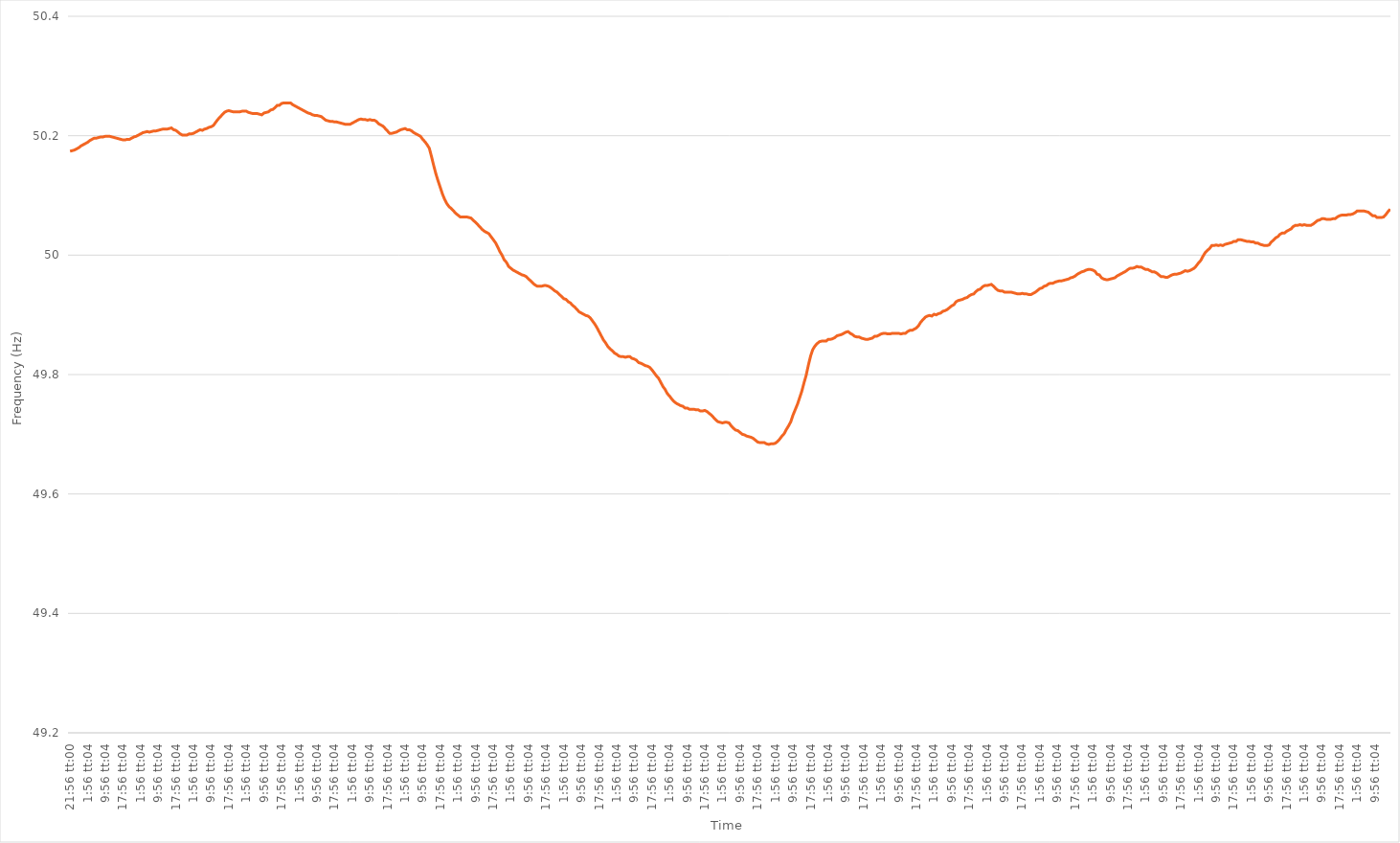
| Category | Series 0 |
|---|---|
| 0.9138888888888889 | 50.174 |
| 0.913900462962963 | 50.175 |
| 0.9139120370370369 | 50.176 |
| 0.9139236111111111 | 50.178 |
| 0.9139351851851852 | 50.18 |
| 0.955601851851852 | 50.183 |
| 0.997268518518519 | 50.185 |
| 1900-01-01 00:56:04 | 50.187 |
| 1900-01-01 01:56:04 | 50.189 |
| 1900-01-01 02:56:04 | 50.192 |
| 1900-01-01 03:56:04 | 50.194 |
| 1900-01-01 04:56:04 | 50.196 |
| 1900-01-01 05:56:04 | 50.196 |
| 1900-01-01 06:56:04 | 50.197 |
| 1900-01-01 07:56:04 | 50.198 |
| 1900-01-01 08:56:04 | 50.198 |
| 1900-01-01 09:56:04 | 50.199 |
| 1900-01-01 10:56:04 | 50.199 |
| 1900-01-01 11:56:04 | 50.199 |
| 1900-01-01 12:56:04 | 50.198 |
| 1900-01-01 13:56:04 | 50.197 |
| 1900-01-01 14:56:04 | 50.196 |
| 1900-01-01 15:56:04 | 50.195 |
| 1900-01-01 16:56:04 | 50.194 |
| 1900-01-01 17:56:04 | 50.193 |
| 1900-01-01 18:56:04 | 50.193 |
| 1900-01-01 19:56:04 | 50.194 |
| 1900-01-01 20:56:04 | 50.194 |
| 1900-01-01 21:56:04 | 50.196 |
| 1900-01-01 22:56:04 | 50.198 |
| 1900-01-01 23:56:04 | 50.199 |
| 1900-01-02 00:56:04 | 50.201 |
| 1900-01-02 01:56:04 | 50.203 |
| 1900-01-02 02:56:04 | 50.205 |
| 1900-01-02 03:56:04 | 50.206 |
| 1900-01-02 04:56:04 | 50.207 |
| 1900-01-02 05:56:04 | 50.206 |
| 1900-01-02 06:56:04 | 50.207 |
| 1900-01-02 07:56:04 | 50.208 |
| 1900-01-02 08:56:04 | 50.208 |
| 1900-01-02 09:56:04 | 50.209 |
| 1900-01-02 10:56:04 | 50.21 |
| 1900-01-02 11:56:04 | 50.211 |
| 1900-01-02 12:56:04 | 50.211 |
| 1900-01-02 13:56:04 | 50.211 |
| 1900-01-02 14:56:04 | 50.212 |
| 1900-01-02 15:56:04 | 50.213 |
| 1900-01-02 16:56:04 | 50.21 |
| 1900-01-02 17:56:04 | 50.209 |
| 1900-01-02 18:56:04 | 50.206 |
| 1900-01-02 19:56:04 | 50.203 |
| 1900-01-02 20:56:04 | 50.201 |
| 1900-01-02 21:56:04 | 50.201 |
| 1900-01-02 22:56:04 | 50.201 |
| 1900-01-02 23:56:04 | 50.203 |
| 1900-01-03 00:56:04 | 50.203 |
| 1900-01-03 01:56:04 | 50.204 |
| 1900-01-03 02:56:04 | 50.206 |
| 1900-01-03 03:56:04 | 50.208 |
| 1900-01-03 04:56:04 | 50.21 |
| 1900-01-03 05:56:04 | 50.209 |
| 1900-01-03 06:56:04 | 50.211 |
| 1900-01-03 07:56:04 | 50.212 |
| 1900-01-03 08:56:04 | 50.214 |
| 1900-01-03 09:56:04 | 50.215 |
| 1900-01-03 10:56:04 | 50.217 |
| 1900-01-03 11:56:04 | 50.222 |
| 1900-01-03 12:56:04 | 50.227 |
| 1900-01-03 13:56:04 | 50.231 |
| 1900-01-03 14:56:04 | 50.235 |
| 1900-01-03 15:56:04 | 50.239 |
| 1900-01-03 16:56:04 | 50.241 |
| 1900-01-03 17:56:04 | 50.242 |
| 1900-01-03 18:56:04 | 50.241 |
| 1900-01-03 19:56:04 | 50.24 |
| 1900-01-03 20:56:04 | 50.24 |
| 1900-01-03 21:56:04 | 50.24 |
| 1900-01-03 22:56:04 | 50.24 |
| 1900-01-03 23:56:04 | 50.241 |
| 1900-01-04 00:56:04 | 50.241 |
| 1900-01-04 01:56:04 | 50.241 |
| 1900-01-04 02:56:04 | 50.239 |
| 1900-01-04 03:56:04 | 50.238 |
| 1900-01-04 04:56:04 | 50.237 |
| 1900-01-04 05:56:04 | 50.237 |
| 1900-01-04 06:56:04 | 50.237 |
| 1900-01-04 07:56:04 | 50.236 |
| 1900-01-04 08:56:04 | 50.235 |
| 1900-01-04 09:56:04 | 50.238 |
| 1900-01-04 10:56:04 | 50.239 |
| 1900-01-04 11:56:04 | 50.24 |
| 1900-01-04 12:56:04 | 50.243 |
| 1900-01-04 13:56:04 | 50.244 |
| 1900-01-04 14:56:04 | 50.247 |
| 1900-01-04 15:56:04 | 50.251 |
| 1900-01-04 16:56:04 | 50.251 |
| 1900-01-04 17:56:04 | 50.254 |
| 1900-01-04 18:56:04 | 50.255 |
| 1900-01-04 19:56:04 | 50.255 |
| 1900-01-04 20:56:04 | 50.255 |
| 1900-01-04 21:56:04 | 50.255 |
| 1900-01-04 22:56:04 | 50.252 |
| 1900-01-04 23:56:04 | 50.25 |
| 1900-01-05 00:56:04 | 50.248 |
| 1900-01-05 01:56:04 | 50.246 |
| 1900-01-05 02:56:04 | 50.244 |
| 1900-01-05 03:56:04 | 50.242 |
| 1900-01-05 04:56:04 | 50.24 |
| 1900-01-05 05:56:04 | 50.238 |
| 1900-01-05 06:56:04 | 50.237 |
| 1900-01-05 07:56:04 | 50.235 |
| 1900-01-05 08:56:04 | 50.234 |
| 1900-01-05 09:56:04 | 50.234 |
| 1900-01-05 10:56:04 | 50.233 |
| 1900-01-05 11:56:04 | 50.232 |
| 1900-01-05 12:56:04 | 50.229 |
| 1900-01-05 13:56:04 | 50.226 |
| 1900-01-05 14:56:04 | 50.225 |
| 1900-01-05 15:56:04 | 50.224 |
| 1900-01-05 16:56:04 | 50.224 |
| 1900-01-05 17:56:04 | 50.223 |
| 1900-01-05 18:56:04 | 50.223 |
| 1900-01-05 19:56:04 | 50.222 |
| 1900-01-05 20:56:04 | 50.221 |
| 1900-01-05 21:56:04 | 50.22 |
| 1900-01-05 22:56:04 | 50.219 |
| 1900-01-05 23:56:04 | 50.219 |
| 1900-01-06 00:56:04 | 50.219 |
| 1900-01-06 01:56:04 | 50.221 |
| 1900-01-06 02:56:04 | 50.223 |
| 1900-01-06 03:56:04 | 50.225 |
| 1900-01-06 04:56:04 | 50.227 |
| 1900-01-06 05:56:04 | 50.228 |
| 1900-01-06 06:56:04 | 50.227 |
| 1900-01-06 07:56:04 | 50.227 |
| 1900-01-06 08:56:04 | 50.226 |
| 1900-01-06 09:56:04 | 50.227 |
| 1900-01-06 10:56:04 | 50.226 |
| 1900-01-06 11:56:04 | 50.226 |
| 1900-01-06 12:56:04 | 50.224 |
| 1900-01-06 13:56:04 | 50.22 |
| 1900-01-06 14:56:04 | 50.218 |
| 1900-01-06 15:56:04 | 50.216 |
| 1900-01-06 16:56:04 | 50.212 |
| 1900-01-06 17:56:04 | 50.208 |
| 1900-01-06 18:56:04 | 50.204 |
| 1900-01-06 19:56:04 | 50.204 |
| 1900-01-06 20:56:04 | 50.205 |
| 1900-01-06 21:56:04 | 50.206 |
| 1900-01-06 22:56:04 | 50.208 |
| 1900-01-06 23:56:04 | 50.21 |
| 1900-01-07 00:56:04 | 50.211 |
| 1900-01-07 01:56:04 | 50.212 |
| 1900-01-07 02:56:04 | 50.21 |
| 1900-01-07 03:56:04 | 50.21 |
| 1900-01-07 04:56:04 | 50.208 |
| 1900-01-07 05:56:04 | 50.205 |
| 1900-01-07 06:56:04 | 50.203 |
| 1900-01-07 07:56:04 | 50.201 |
| 1900-01-07 08:56:04 | 50.199 |
| 1900-01-07 09:56:04 | 50.194 |
| 1900-01-07 10:56:04 | 50.19 |
| 1900-01-07 11:56:04 | 50.185 |
| 1900-01-07 12:56:04 | 50.179 |
| 1900-01-07 13:56:04 | 50.165 |
| 1900-01-07 14:56:04 | 50.15 |
| 1900-01-07 15:56:04 | 50.136 |
| 1900-01-07 16:56:04 | 50.124 |
| 1900-01-07 17:56:04 | 50.113 |
| 1900-01-07 18:56:04 | 50.102 |
| 1900-01-07 19:56:04 | 50.093 |
| 1900-01-07 20:56:04 | 50.086 |
| 1900-01-07 21:56:04 | 50.081 |
| 1900-01-07 22:56:04 | 50.078 |
| 1900-01-07 23:56:04 | 50.074 |
| 1900-01-08 00:56:04 | 50.07 |
| 1900-01-08 01:56:04 | 50.067 |
| 1900-01-08 02:56:04 | 50.064 |
| 1900-01-08 03:56:04 | 50.064 |
| 1900-01-08 04:56:04 | 50.064 |
| 1900-01-08 05:56:04 | 50.064 |
| 1900-01-08 06:56:04 | 50.063 |
| 1900-01-08 07:56:04 | 50.062 |
| 1900-01-08 08:56:04 | 50.058 |
| 1900-01-08 09:56:04 | 50.055 |
| 1900-01-08 10:56:04 | 50.051 |
| 1900-01-08 11:56:04 | 50.047 |
| 1900-01-08 12:56:04 | 50.043 |
| 1900-01-08 13:56:04 | 50.04 |
| 1900-01-08 14:56:04 | 50.038 |
| 1900-01-08 15:56:04 | 50.036 |
| 1900-01-08 16:56:04 | 50.031 |
| 1900-01-08 17:56:04 | 50.026 |
| 1900-01-08 18:56:04 | 50.021 |
| 1900-01-08 19:56:04 | 50.014 |
| 1900-01-08 20:56:04 | 50.006 |
| 1900-01-08 21:56:04 | 50 |
| 1900-01-08 22:56:04 | 49.992 |
| 1900-01-08 23:56:04 | 49.988 |
| 1900-01-09 00:56:04 | 49.981 |
| 1900-01-09 01:56:04 | 49.978 |
| 1900-01-09 02:56:04 | 49.975 |
| 1900-01-09 03:56:04 | 49.973 |
| 1900-01-09 04:56:04 | 49.971 |
| 1900-01-09 05:56:04 | 49.969 |
| 1900-01-09 06:56:04 | 49.967 |
| 1900-01-09 07:56:04 | 49.966 |
| 1900-01-09 08:56:04 | 49.964 |
| 1900-01-09 09:56:04 | 49.96 |
| 1900-01-09 10:56:04 | 49.957 |
| 1900-01-09 11:56:04 | 49.953 |
| 1900-01-09 12:56:04 | 49.95 |
| 1900-01-09 13:56:04 | 49.948 |
| 1900-01-09 14:56:04 | 49.948 |
| 1900-01-09 15:56:04 | 49.948 |
| 1900-01-09 16:56:04 | 49.949 |
| 1900-01-09 17:56:04 | 49.949 |
| 1900-01-09 18:56:04 | 49.948 |
| 1900-01-09 19:56:04 | 49.946 |
| 1900-01-09 20:56:04 | 49.943 |
| 1900-01-09 21:56:04 | 49.94 |
| 1900-01-09 22:56:04 | 49.938 |
| 1900-01-09 23:56:04 | 49.934 |
| 1900-01-10 00:56:04 | 49.931 |
| 1900-01-10 01:56:04 | 49.927 |
| 1900-01-10 02:56:04 | 49.926 |
| 1900-01-10 03:56:04 | 49.922 |
| 1900-01-10 04:56:04 | 49.92 |
| 1900-01-10 05:56:04 | 49.916 |
| 1900-01-10 06:56:04 | 49.913 |
| 1900-01-10 07:56:04 | 49.909 |
| 1900-01-10 08:56:04 | 49.905 |
| 1900-01-10 09:56:04 | 49.903 |
| 1900-01-10 10:56:04 | 49.901 |
| 1900-01-10 11:56:04 | 49.899 |
| 1900-01-10 12:56:04 | 49.898 |
| 1900-01-10 13:56:04 | 49.895 |
| 1900-01-10 14:56:04 | 49.89 |
| 1900-01-10 15:56:04 | 49.885 |
| 1900-01-10 16:56:04 | 49.879 |
| 1900-01-10 17:56:04 | 49.872 |
| 1900-01-10 18:56:04 | 49.865 |
| 1900-01-10 19:56:04 | 49.858 |
| 1900-01-10 20:56:04 | 49.853 |
| 1900-01-10 21:56:04 | 49.847 |
| 1900-01-10 22:56:04 | 49.843 |
| 1900-01-10 23:56:04 | 49.84 |
| 1900-01-11 00:56:04 | 49.836 |
| 1900-01-11 01:56:04 | 49.834 |
| 1900-01-11 02:56:04 | 49.831 |
| 1900-01-11 03:56:04 | 49.83 |
| 1900-01-11 04:56:04 | 49.83 |
| 1900-01-11 05:56:04 | 49.829 |
| 1900-01-11 06:56:04 | 49.83 |
| 1900-01-11 07:56:04 | 49.83 |
| 1900-01-11 08:56:04 | 49.827 |
| 1900-01-11 09:56:04 | 49.826 |
| 1900-01-11 10:56:04 | 49.824 |
| 1900-01-11 11:56:04 | 49.82 |
| 1900-01-11 12:56:04 | 49.819 |
| 1900-01-11 13:56:04 | 49.817 |
| 1900-01-11 14:56:04 | 49.815 |
| 1900-01-11 15:56:04 | 49.814 |
| 1900-01-11 16:56:04 | 49.812 |
| 1900-01-11 17:56:04 | 49.808 |
| 1900-01-11 18:56:04 | 49.803 |
| 1900-01-11 19:56:04 | 49.798 |
| 1900-01-11 20:56:04 | 49.794 |
| 1900-01-11 21:56:04 | 49.787 |
| 1900-01-11 22:56:04 | 49.78 |
| 1900-01-11 23:56:04 | 49.775 |
| 1900-01-12 00:56:04 | 49.768 |
| 1900-01-12 01:56:04 | 49.764 |
| 1900-01-12 02:56:04 | 49.759 |
| 1900-01-12 03:56:04 | 49.755 |
| 1900-01-12 04:56:04 | 49.752 |
| 1900-01-12 05:56:04 | 49.75 |
| 1900-01-12 06:56:04 | 49.748 |
| 1900-01-12 07:56:04 | 49.747 |
| 1900-01-12 08:56:04 | 49.744 |
| 1900-01-12 09:56:04 | 49.744 |
| 1900-01-12 10:56:04 | 49.742 |
| 1900-01-12 11:56:04 | 49.742 |
| 1900-01-12 12:56:04 | 49.742 |
| 1900-01-12 13:56:04 | 49.741 |
| 1900-01-12 14:56:04 | 49.741 |
| 1900-01-12 15:56:04 | 49.739 |
| 1900-01-12 16:56:04 | 49.739 |
| 1900-01-12 17:56:04 | 49.74 |
| 1900-01-12 18:56:04 | 49.738 |
| 1900-01-12 19:56:04 | 49.735 |
| 1900-01-12 20:56:04 | 49.732 |
| 1900-01-12 21:56:04 | 49.728 |
| 1900-01-12 22:56:04 | 49.724 |
| 1900-01-12 23:56:04 | 49.721 |
| 1900-01-13 00:56:04 | 49.72 |
| 1900-01-13 01:56:04 | 49.719 |
| 1900-01-13 02:56:04 | 49.72 |
| 1900-01-13 03:56:04 | 49.72 |
| 1900-01-13 04:56:04 | 49.719 |
| 1900-01-13 05:56:04 | 49.714 |
| 1900-01-13 06:56:04 | 49.71 |
| 1900-01-13 07:56:04 | 49.707 |
| 1900-01-13 08:56:04 | 49.706 |
| 1900-01-13 09:56:04 | 49.703 |
| 1900-01-13 10:56:04 | 49.7 |
| 1900-01-13 11:56:04 | 49.699 |
| 1900-01-13 12:56:04 | 49.697 |
| 1900-01-13 13:56:04 | 49.696 |
| 1900-01-13 14:56:04 | 49.695 |
| 1900-01-13 15:56:04 | 49.693 |
| 1900-01-13 16:56:04 | 49.69 |
| 1900-01-13 17:56:04 | 49.687 |
| 1900-01-13 18:56:04 | 49.686 |
| 1900-01-13 19:56:04 | 49.686 |
| 1900-01-13 20:56:04 | 49.686 |
| 1900-01-13 21:56:04 | 49.684 |
| 1900-01-13 22:56:04 | 49.683 |
| 1900-01-13 23:56:04 | 49.684 |
| 1900-01-14 00:56:04 | 49.684 |
| 1900-01-14 01:56:04 | 49.685 |
| 1900-01-14 02:56:04 | 49.688 |
| 1900-01-14 03:56:04 | 49.692 |
| 1900-01-14 04:56:04 | 49.697 |
| 1900-01-14 05:56:04 | 49.701 |
| 1900-01-14 06:56:04 | 49.708 |
| 1900-01-14 07:56:04 | 49.714 |
| 1900-01-14 08:56:04 | 49.721 |
| 1900-01-14 09:56:04 | 49.732 |
| 1900-01-14 10:56:04 | 49.741 |
| 1900-01-14 11:56:04 | 49.75 |
| 1900-01-14 12:56:04 | 49.761 |
| 1900-01-14 13:56:04 | 49.772 |
| 1900-01-14 14:56:04 | 49.786 |
| 1900-01-14 15:56:04 | 49.799 |
| 1900-01-14 16:56:04 | 49.816 |
| 1900-01-14 17:56:04 | 49.831 |
| 1900-01-14 18:56:04 | 49.842 |
| 1900-01-14 19:56:04 | 49.848 |
| 1900-01-14 20:56:04 | 49.852 |
| 1900-01-14 21:56:04 | 49.855 |
| 1900-01-14 22:56:04 | 49.856 |
| 1900-01-14 23:56:04 | 49.856 |
| 1900-01-15 00:56:04 | 49.856 |
| 1900-01-15 01:56:04 | 49.859 |
| 1900-01-15 02:56:04 | 49.859 |
| 1900-01-15 03:56:04 | 49.86 |
| 1900-01-15 04:56:04 | 49.862 |
| 1900-01-15 05:56:04 | 49.865 |
| 1900-01-15 06:56:04 | 49.866 |
| 1900-01-15 07:56:04 | 49.867 |
| 1900-01-15 08:56:04 | 49.869 |
| 1900-01-15 09:56:04 | 49.871 |
| 1900-01-15 10:56:04 | 49.872 |
| 1900-01-15 11:56:04 | 49.869 |
| 1900-01-15 12:56:04 | 49.867 |
| 1900-01-15 13:56:04 | 49.864 |
| 1900-01-15 14:56:04 | 49.863 |
| 1900-01-15 15:56:04 | 49.863 |
| 1900-01-15 16:56:04 | 49.861 |
| 1900-01-15 17:56:04 | 49.86 |
| 1900-01-15 18:56:04 | 49.859 |
| 1900-01-15 19:56:04 | 49.859 |
| 1900-01-15 20:56:04 | 49.86 |
| 1900-01-15 21:56:04 | 49.861 |
| 1900-01-15 22:56:04 | 49.864 |
| 1900-01-15 23:56:04 | 49.864 |
| 1900-01-16 00:56:04 | 49.866 |
| 1900-01-16 01:56:04 | 49.868 |
| 1900-01-16 02:56:04 | 49.869 |
| 1900-01-16 03:56:04 | 49.869 |
| 1900-01-16 04:56:04 | 49.868 |
| 1900-01-16 05:56:04 | 49.868 |
| 1900-01-16 06:56:04 | 49.869 |
| 1900-01-16 07:56:04 | 49.869 |
| 1900-01-16 08:56:04 | 49.869 |
| 1900-01-16 09:56:04 | 49.869 |
| 1900-01-16 10:56:04 | 49.868 |
| 1900-01-16 11:56:04 | 49.869 |
| 1900-01-16 12:56:04 | 49.869 |
| 1900-01-16 13:56:04 | 49.872 |
| 1900-01-16 14:56:04 | 49.874 |
| 1900-01-16 15:56:04 | 49.874 |
| 1900-01-16 16:56:04 | 49.876 |
| 1900-01-16 17:56:04 | 49.878 |
| 1900-01-16 18:56:04 | 49.882 |
| 1900-01-16 19:56:04 | 49.888 |
| 1900-01-16 20:56:04 | 49.892 |
| 1900-01-16 21:56:04 | 49.896 |
| 1900-01-16 22:56:04 | 49.898 |
| 1900-01-16 23:56:04 | 49.899 |
| 1900-01-17 00:56:04 | 49.898 |
| 1900-01-17 01:56:04 | 49.901 |
| 1900-01-17 02:56:04 | 49.9 |
| 1900-01-17 03:56:04 | 49.902 |
| 1900-01-17 04:56:04 | 49.903 |
| 1900-01-17 05:56:04 | 49.906 |
| 1900-01-17 06:56:04 | 49.907 |
| 1900-01-17 07:56:04 | 49.909 |
| 1900-01-17 08:56:04 | 49.912 |
| 1900-01-17 09:56:04 | 49.915 |
| 1900-01-17 10:56:04 | 49.917 |
| 1900-01-17 11:56:04 | 49.922 |
| 1900-01-17 12:56:04 | 49.924 |
| 1900-01-17 13:56:04 | 49.925 |
| 1900-01-17 14:56:04 | 49.926 |
| 1900-01-17 15:56:04 | 49.928 |
| 1900-01-17 16:56:04 | 49.929 |
| 1900-01-17 17:56:04 | 49.932 |
| 1900-01-17 18:56:04 | 49.934 |
| 1900-01-17 19:56:04 | 49.935 |
| 1900-01-17 20:56:04 | 49.939 |
| 1900-01-17 21:56:04 | 49.942 |
| 1900-01-17 22:56:04 | 49.943 |
| 1900-01-17 23:56:04 | 49.947 |
| 1900-01-18 00:56:04 | 49.949 |
| 1900-01-18 01:56:04 | 49.949 |
| 1900-01-18 02:56:04 | 49.95 |
| 1900-01-18 03:56:04 | 49.951 |
| 1900-01-18 04:56:04 | 49.948 |
| 1900-01-18 05:56:04 | 49.944 |
| 1900-01-18 06:56:04 | 49.941 |
| 1900-01-18 07:56:04 | 49.94 |
| 1900-01-18 08:56:04 | 49.94 |
| 1900-01-18 09:56:04 | 49.938 |
| 1900-01-18 10:56:04 | 49.938 |
| 1900-01-18 11:56:04 | 49.938 |
| 1900-01-18 12:56:04 | 49.938 |
| 1900-01-18 13:56:04 | 49.937 |
| 1900-01-18 14:56:04 | 49.936 |
| 1900-01-18 15:56:04 | 49.935 |
| 1900-01-18 16:56:04 | 49.935 |
| 1900-01-18 17:56:04 | 49.936 |
| 1900-01-18 18:56:04 | 49.935 |
| 1900-01-18 19:56:04 | 49.935 |
| 1900-01-18 20:56:04 | 49.934 |
| 1900-01-18 21:56:04 | 49.934 |
| 1900-01-18 22:56:04 | 49.936 |
| 1900-01-18 23:56:04 | 49.938 |
| 1900-01-19 00:56:04 | 49.941 |
| 1900-01-19 01:56:04 | 49.944 |
| 1900-01-19 02:56:04 | 49.945 |
| 1900-01-19 03:56:04 | 49.948 |
| 1900-01-19 04:56:04 | 49.949 |
| 1900-01-19 05:56:04 | 49.952 |
| 1900-01-19 06:56:04 | 49.953 |
| 1900-01-19 07:56:04 | 49.953 |
| 1900-01-19 08:56:04 | 49.955 |
| 1900-01-19 09:56:04 | 49.956 |
| 1900-01-19 10:56:04 | 49.957 |
| 1900-01-19 11:56:04 | 49.957 |
| 1900-01-19 12:56:04 | 49.958 |
| 1900-01-19 13:56:04 | 49.959 |
| 1900-01-19 14:56:04 | 49.96 |
| 1900-01-19 15:56:04 | 49.962 |
| 1900-01-19 16:56:04 | 49.963 |
| 1900-01-19 17:56:04 | 49.965 |
| 1900-01-19 18:56:04 | 49.968 |
| 1900-01-19 19:56:04 | 49.97 |
| 1900-01-19 20:56:04 | 49.972 |
| 1900-01-19 21:56:04 | 49.973 |
| 1900-01-19 22:56:04 | 49.975 |
| 1900-01-19 23:56:04 | 49.976 |
| 1900-01-20 00:56:04 | 49.976 |
| 1900-01-20 01:56:04 | 49.975 |
| 1900-01-20 02:56:04 | 49.973 |
| 1900-01-20 03:56:04 | 49.968 |
| 1900-01-20 04:56:04 | 49.967 |
| 1900-01-20 05:56:04 | 49.962 |
| 1900-01-20 06:56:04 | 49.96 |
| 1900-01-20 07:56:04 | 49.959 |
| 1900-01-20 08:56:04 | 49.959 |
| 1900-01-20 09:56:04 | 49.96 |
| 1900-01-20 10:56:04 | 49.961 |
| 1900-01-20 11:56:04 | 49.962 |
| 1900-01-20 12:56:04 | 49.965 |
| 1900-01-20 13:56:04 | 49.967 |
| 1900-01-20 14:56:04 | 49.969 |
| 1900-01-20 15:56:04 | 49.971 |
| 1900-01-20 16:56:04 | 49.973 |
| 1900-01-20 17:56:04 | 49.976 |
| 1900-01-20 18:56:04 | 49.978 |
| 1900-01-20 19:56:04 | 49.978 |
| 1900-01-20 20:56:04 | 49.979 |
| 1900-01-20 21:56:04 | 49.981 |
| 1900-01-20 22:56:04 | 49.98 |
| 1900-01-20 23:56:04 | 49.98 |
| 1900-01-21 00:56:04 | 49.978 |
| 1900-01-21 01:56:04 | 49.976 |
| 1900-01-21 02:56:04 | 49.976 |
| 1900-01-21 03:56:04 | 49.974 |
| 1900-01-21 04:56:04 | 49.972 |
| 1900-01-21 05:56:04 | 49.972 |
| 1900-01-21 06:56:04 | 49.97 |
| 1900-01-21 07:56:04 | 49.967 |
| 1900-01-21 08:56:04 | 49.964 |
| 1900-01-21 09:56:04 | 49.964 |
| 1900-01-21 10:56:04 | 49.963 |
| 1900-01-21 11:56:04 | 49.963 |
| 1900-01-21 12:56:04 | 49.965 |
| 1900-01-21 13:56:04 | 49.967 |
| 1900-01-21 14:56:04 | 49.968 |
| 1900-01-21 15:56:04 | 49.968 |
| 1900-01-21 16:56:04 | 49.969 |
| 1900-01-21 17:56:04 | 49.97 |
| 1900-01-21 18:56:04 | 49.972 |
| 1900-01-21 19:56:04 | 49.974 |
| 1900-01-21 20:56:04 | 49.973 |
| 1900-01-21 21:56:04 | 49.974 |
| 1900-01-21 22:56:04 | 49.976 |
| 1900-01-21 23:56:04 | 49.978 |
| 1900-01-22 00:56:04 | 49.982 |
| 1900-01-22 01:56:04 | 49.987 |
| 1900-01-22 02:56:04 | 49.991 |
| 1900-01-22 03:56:04 | 49.998 |
| 1900-01-22 04:56:04 | 50.004 |
| 1900-01-22 05:56:04 | 50.008 |
| 1900-01-22 06:56:04 | 50.011 |
| 1900-01-22 07:56:04 | 50.016 |
| 1900-01-22 08:56:04 | 50.016 |
| 1900-01-22 09:56:04 | 50.017 |
| 1900-01-22 10:56:04 | 50.016 |
| 1900-01-22 11:56:04 | 50.017 |
| 1900-01-22 12:56:04 | 50.016 |
| 1900-01-22 13:56:04 | 50.018 |
| 1900-01-22 14:56:04 | 50.019 |
| 1900-01-22 15:56:04 | 50.02 |
| 1900-01-22 16:56:04 | 50.021 |
| 1900-01-22 17:56:04 | 50.023 |
| 1900-01-22 18:56:04 | 50.023 |
| 1900-01-22 19:56:04 | 50.026 |
| 1900-01-22 20:56:04 | 50.026 |
| 1900-01-22 21:56:04 | 50.025 |
| 1900-01-22 22:56:04 | 50.024 |
| 1900-01-22 23:56:04 | 50.023 |
| 1900-01-23 00:56:04 | 50.023 |
| 1900-01-23 01:56:04 | 50.022 |
| 1900-01-23 02:56:04 | 50.022 |
| 1900-01-23 03:56:04 | 50.02 |
| 1900-01-23 04:56:04 | 50.02 |
| 1900-01-23 05:56:04 | 50.018 |
| 1900-01-23 06:56:04 | 50.017 |
| 1900-01-23 07:56:04 | 50.016 |
| 1900-01-23 08:56:04 | 50.016 |
| 1900-01-23 09:56:04 | 50.017 |
| 1900-01-23 10:56:04 | 50.022 |
| 1900-01-23 11:56:04 | 50.025 |
| 1900-01-23 12:56:04 | 50.029 |
| 1900-01-23 13:56:04 | 50.031 |
| 1900-01-23 14:56:04 | 50.035 |
| 1900-01-23 15:56:04 | 50.037 |
| 1900-01-23 16:56:04 | 50.037 |
| 1900-01-23 17:56:04 | 50.04 |
| 1900-01-23 18:56:04 | 50.042 |
| 1900-01-23 19:56:04 | 50.044 |
| 1900-01-23 20:56:04 | 50.048 |
| 1900-01-23 21:56:04 | 50.05 |
| 1900-01-23 22:56:04 | 50.05 |
| 1900-01-23 23:56:04 | 50.051 |
| 1900-01-24 00:56:04 | 50.05 |
| 1900-01-24 01:56:04 | 50.051 |
| 1900-01-24 02:56:04 | 50.05 |
| 1900-01-24 03:56:04 | 50.05 |
| 1900-01-24 04:56:04 | 50.05 |
| 1900-01-24 05:56:04 | 50.052 |
| 1900-01-24 06:56:04 | 50.055 |
| 1900-01-24 07:56:04 | 50.058 |
| 1900-01-24 08:56:04 | 50.059 |
| 1900-01-24 09:56:04 | 50.061 |
| 1900-01-24 10:56:04 | 50.061 |
| 1900-01-24 11:56:04 | 50.06 |
| 1900-01-24 12:56:04 | 50.06 |
| 1900-01-24 13:56:04 | 50.06 |
| 1900-01-24 14:56:04 | 50.061 |
| 1900-01-24 15:56:04 | 50.061 |
| 1900-01-24 16:56:04 | 50.064 |
| 1900-01-24 17:56:04 | 50.066 |
| 1900-01-24 18:56:04 | 50.067 |
| 1900-01-24 19:56:04 | 50.067 |
| 1900-01-24 20:56:04 | 50.067 |
| 1900-01-24 21:56:04 | 50.068 |
| 1900-01-24 22:56:04 | 50.068 |
| 1900-01-24 23:56:04 | 50.069 |
| 1900-01-25 00:56:04 | 50.071 |
| 1900-01-25 01:56:04 | 50.074 |
| 1900-01-25 02:56:04 | 50.074 |
| 1900-01-25 03:56:04 | 50.074 |
| 1900-01-25 04:56:04 | 50.074 |
| 1900-01-25 05:56:04 | 50.073 |
| 1900-01-25 06:56:04 | 50.072 |
| 1900-01-25 07:56:04 | 50.069 |
| 1900-01-25 08:56:04 | 50.066 |
| 1900-01-25 09:56:04 | 50.066 |
| 1900-01-25 10:56:04 | 50.063 |
| 1900-01-25 11:56:04 | 50.063 |
| 1900-01-25 12:56:04 | 50.063 |
| 1900-01-25 13:56:04 | 50.064 |
| 1900-01-25 14:56:04 | 50.068 |
| 1900-01-25 15:56:04 | 50.073 |
| 1900-01-25 16:56:04 | 50.077 |